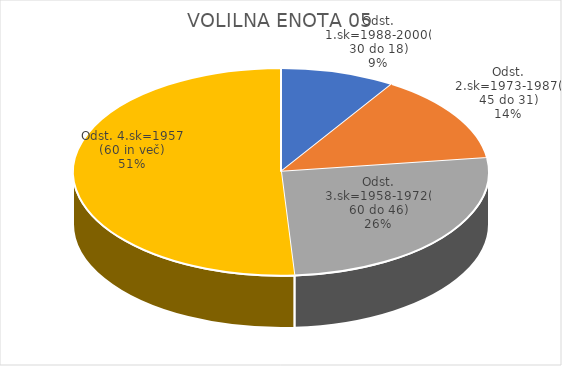
| Category | VOLILNA ENOTA 05 |
|---|---|
| Odst. 1.sk=1988-2000(30 do 18) | 1.27 |
| Odst. 2.sk=1973-1987(45 do 31) | 1.97 |
| Odst. 3.sk=1958-1972(60 do 46) | 3.7 |
| Odst. 4.sk=1957 (60 in več) | 7.23 |